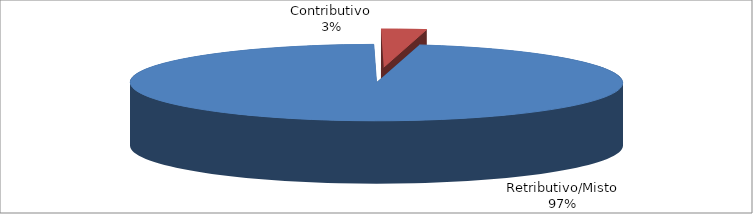
| Category | Decorrenti ANNO 2020 |
|---|---|
| Retributivo/Misto | 35641 |
| Contributivo | 1086 |